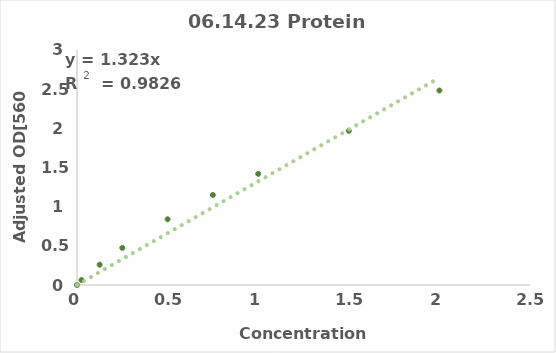
| Category | Series 0 |
|---|---|
| 0.0 | 0 |
| 0.025 | 0.064 |
| 0.125 | 0.259 |
| 0.25 | 0.474 |
| 0.5 | 0.839 |
| 0.75 | 1.149 |
| 1.0 | 1.419 |
| 1.5 | 1.968 |
| 2.0 | 2.483 |